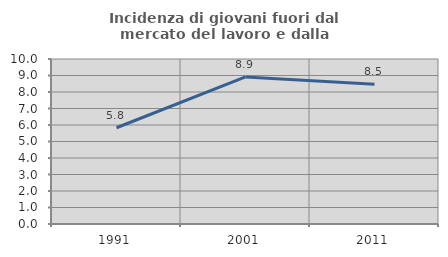
| Category | Incidenza di giovani fuori dal mercato del lavoro e dalla formazione  |
|---|---|
| 1991.0 | 5.833 |
| 2001.0 | 8.911 |
| 2011.0 | 8.475 |